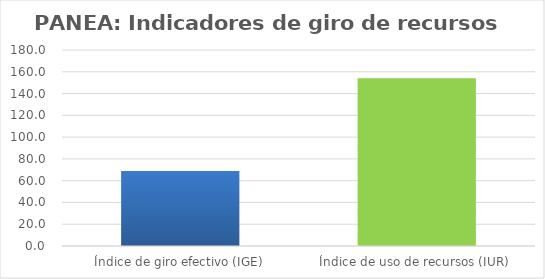
| Category | Series 0 |
|---|---|
| Índice de giro efectivo (IGE) | 68.876 |
| Índice de uso de recursos (IUR)  | 154.035 |